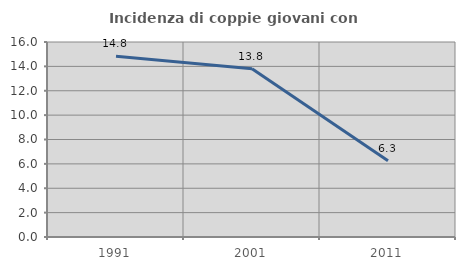
| Category | Incidenza di coppie giovani con figli |
|---|---|
| 1991.0 | 14.828 |
| 2001.0 | 13.805 |
| 2011.0 | 6.25 |